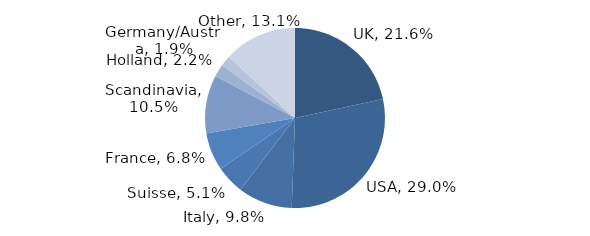
| Category | Investment Style |
|---|---|
| UK | 0.216 |
| USA | 0.29 |
| Italy | 0.098 |
| Suisse | 0.051 |
| France | 0.068 |
| Scandinavia | 0.105 |
| Holland | 0.022 |
| Germany/Austria | 0.019 |
| Other | 0.131 |